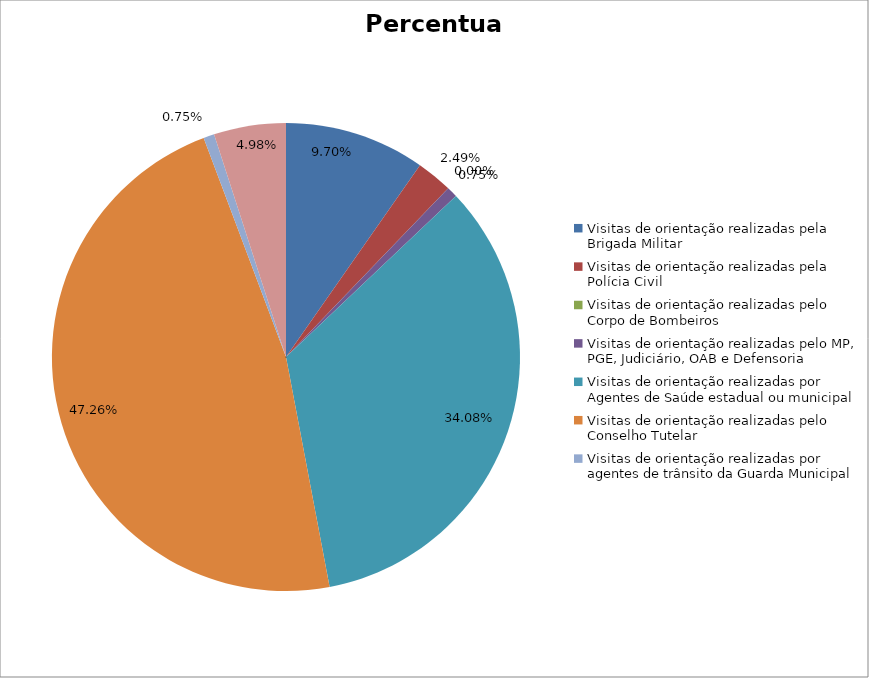
| Category | Percentual |
|---|---|
| Visitas de orientação realizadas pela Brigada Militar | 0.097 |
| Visitas de orientação realizadas pela Polícia Civil | 0.025 |
| Visitas de orientação realizadas pelo Corpo de Bombeiros | 0 |
| Visitas de orientação realizadas pelo MP, PGE, Judiciário, OAB e Defensoria | 0.007 |
| Visitas de orientação realizadas por Agentes de Saúde estadual ou municipal | 0.341 |
| Visitas de orientação realizadas pelo Conselho Tutelar | 0.473 |
| Visitas de orientação realizadas por agentes de trânsito da Guarda Municipal | 0.007 |
| Visitas de orientação realizadas por ONGs, entidades privadas, CRAS e CREAS | 0.05 |